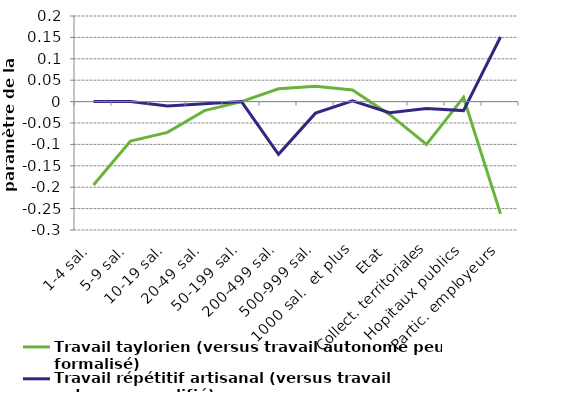
| Category | Travail taylorien (versus travail autonome peu formalisé) | Travail répétitif artisanal (versus travail autonome qualifié) |
|---|---|---|
|  1-4 sal. | -0.195 | 0 |
|  5-9 sal. | -0.092 | 0 |
|  10-19 sal. | -0.072 | -0.01 |
| 20-49 sal. | -0.021 | -0.005 |
|  50-199 sal. | 0 | 0 |
|  200-499 sal. | 0.03 | -0.123 |
|  500-999 sal. | 0.036 | -0.027 |
|  1000 sal.  et plus | 0.027 | 0.002 |
| Etat | -0.03 | -0.026 |
| Collect. territoriales | -0.1 | -0.016 |
| Hopitaux publics | 0.01 | -0.021 |
| Partic. employeurs | -0.262 | 0.151 |